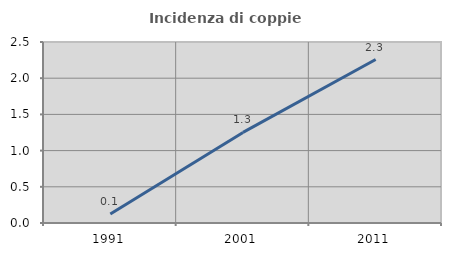
| Category | Incidenza di coppie miste |
|---|---|
| 1991.0 | 0.124 |
| 2001.0 | 1.251 |
| 2011.0 | 2.258 |